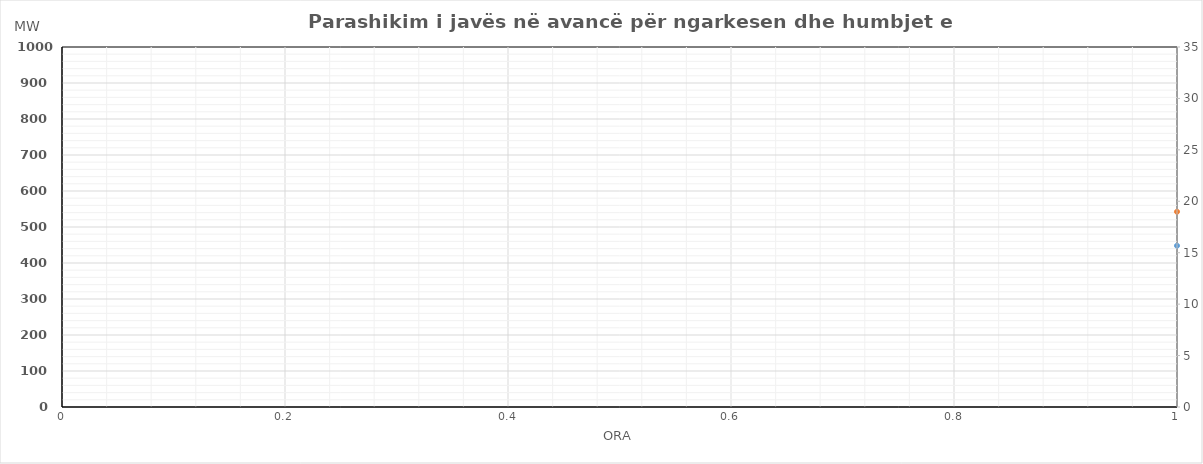
| Category | Ngarkesa (MWh) |
|---|---|
| 0 | 542.351 |
| 1 | 492.09 |
| 2 | 470.229 |
| 3 | 459.083 |
| 4 | 462.184 |
| 5 | 503.105 |
| 6 | 603.894 |
| 7 | 738.318 |
| 8 | 824.747 |
| 9 | 850.717 |
| 10 | 863.638 |
| 11 | 882.054 |
| 12 | 879.22 |
| 13 | 886.765 |
| 14 | 876.903 |
| 15 | 860.491 |
| 16 | 848.547 |
| 17 | 860.632 |
| 18 | 881.353 |
| 19 | 939.291 |
| 20 | 925.787 |
| 21 | 834.097 |
| 22 | 724.655 |
| 23 | 619.722 |
| 24 | 521.717 |
| 25 | 481.999 |
| 26 | 472.229 |
| 27 | 461.083 |
| 28 | 464.184 |
| 29 | 505.105 |
| 30 | 536.849 |
| 31 | 644.094 |
| 32 | 734.784 |
| 33 | 767.247 |
| 34 | 768.934 |
| 35 | 776.337 |
| 36 | 777.379 |
| 37 | 758.621 |
| 38 | 722.624 |
| 39 | 702.966 |
| 40 | 717.668 |
| 41 | 740.823 |
| 42 | 797.261 |
| 43 | 902.002 |
| 44 | 876.772 |
| 45 | 786.827 |
| 46 | 680.656 |
| 47 | 587.637 |
| 48 | 537.666 |
| 49 | 495.931 |
| 50 | 478.606 |
| 51 | 475.137 |
| 52 | 475.597 |
| 53 | 500.181 |
| 54 | 579.946 |
| 55 | 698.977 |
| 56 | 777.784 |
| 57 | 790.77 |
| 58 | 822.017 |
| 59 | 827.572 |
| 60 | 823.159 |
| 61 | 792.846 |
| 62 | 767.772 |
| 63 | 730.481 |
| 64 | 737.768 |
| 65 | 747.08 |
| 66 | 789.745 |
| 67 | 866.703 |
| 68 | 824.691 |
| 69 | 744.895 |
| 70 | 650.422 |
| 71 | 567.883 |
| 72 | 532.516 |
| 73 | 492.637 |
| 74 | 475.427 |
| 75 | 471.549 |
| 76 | 474.917 |
| 77 | 507.897 |
| 78 | 599.551 |
| 79 | 728.904 |
| 80 | 796.784 |
| 81 | 811.64 |
| 82 | 828.945 |
| 83 | 839.312 |
| 84 | 827.514 |
| 85 | 814.894 |
| 86 | 792.651 |
| 87 | 765.46 |
| 88 | 763.149 |
| 89 | 773.924 |
| 90 | 817.55 |
| 91 | 892.011 |
| 92 | 845.682 |
| 93 | 758.415 |
| 94 | 663.22 |
| 95 | 576.614 |
| 96 | 523.316 |
| 97 | 486.605 |
| 98 | 467.523 |
| 99 | 464.117 |
| 100 | 466.154 |
| 101 | 498.308 |
| 102 | 580.336 |
| 103 | 707.533 |
| 104 | 778.448 |
| 105 | 793.863 |
| 106 | 792.699 |
| 107 | 798.81 |
| 108 | 799.874 |
| 109 | 794.233 |
| 110 | 772.407 |
| 111 | 753.856 |
| 112 | 760.079 |
| 113 | 781.095 |
| 114 | 828.386 |
| 115 | 915.725 |
| 116 | 886.622 |
| 117 | 797.282 |
| 118 | 691.559 |
| 119 | 596.277 |
| 120 | 525.619 |
| 121 | 488.85 |
| 122 | 470.515 |
| 123 | 469.366 |
| 124 | 472.103 |
| 125 | 510.813 |
| 126 | 623.019 |
| 127 | 767.555 |
| 128 | 814.441 |
| 129 | 815.474 |
| 130 | 808.233 |
| 131 | 811.699 |
| 132 | 808.579 |
| 133 | 815.2 |
| 134 | 809.797 |
| 135 | 797.364 |
| 136 | 793.515 |
| 137 | 812.076 |
| 138 | 849.85 |
| 139 | 922.861 |
| 140 | 890.618 |
| 141 | 804.259 |
| 142 | 703.425 |
| 143 | 603.777 |
| 144 | 523.366 |
| 145 | 485.343 |
| 146 | 468.248 |
| 147 | 463.961 |
| 148 | 470.236 |
| 149 | 511.613 |
| 150 | 615.155 |
| 151 | 754.831 |
| 152 | 811.784 |
| 153 | 828.51 |
| 154 | 831.874 |
| 155 | 847.051 |
| 156 | 827.87 |
| 157 | 832.942 |
| 158 | 813.529 |
| 159 | 796.439 |
| 160 | 784.53 |
| 161 | 796.767 |
| 162 | 841.355 |
| 163 | 913.32 |
| 164 | 862.674 |
| 165 | 767.935 |
| 166 | 672.018 |
| 167 | 581.345 |